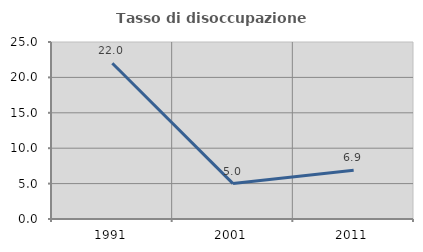
| Category | Tasso di disoccupazione giovanile  |
|---|---|
| 1991.0 | 22 |
| 2001.0 | 5 |
| 2011.0 | 6.897 |